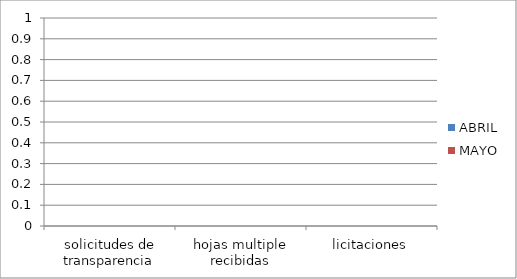
| Category | ABRIL | MAYO |
|---|---|---|
| solicitudes de transparencia | 0 | 0 |
| hojas multiple recibidas | 0 | 0 |
| licitaciones | 0 | 0 |